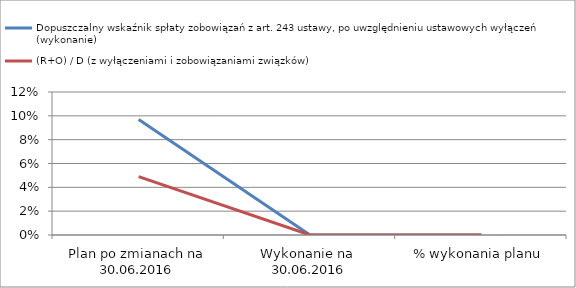
| Category | Dopuszczalny wskaźnik spłaty zobowiązań z art. 243 ustawy, po uwzględnieniu ustawowych wyłączeń (wykonanie)  | (R+O) / D (z wyłączeniami i zobowiązaniami związków) |
|---|---|---|
| Plan po zmianach na 30.06.2016 | 0.097 | 0.049 |
| Wykonanie na  30.06.2016 | 0 | 0 |
| % wykonania planu | 0 | 0 |